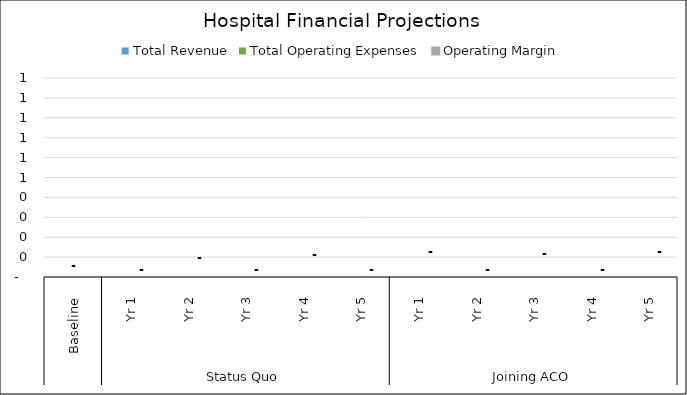
| Category |  Total Revenue  |  Total Operating Expenses  |  Operating Margin  |
|---|---|---|---|
| 0 | 0 | 0 | 0 |
| 1 | 0 | 0 | 0 |
| 2 | 0 | 0 | 0 |
| 3 | 0 | 0 | 0 |
| 4 | 0 | 0 | 0 |
| 5 | 0 | 0 | 0 |
| 6 | 0 | 0 | 0 |
| 7 | 0 | 0 | 0 |
| 8 | 0 | 0 | 0 |
| 9 | 0 | 0 | 0 |
| 10 | 0 | 0 | 0 |